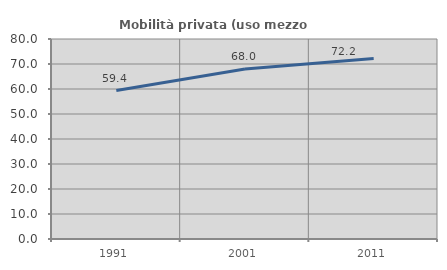
| Category | Mobilità privata (uso mezzo privato) |
|---|---|
| 1991.0 | 59.361 |
| 2001.0 | 67.992 |
| 2011.0 | 72.16 |